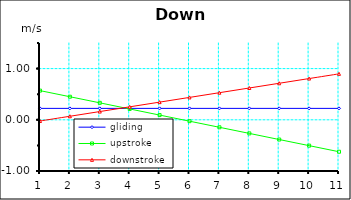
| Category | gliding | upstroke | downstroke |
|---|---|---|---|
| 0 | 0.223 | 0.57 | -0.023 |
| 1 | 0.223 | 0.451 | 0.069 |
| 2 | 0.223 | 0.331 | 0.161 |
| 3 | 0.223 | 0.212 | 0.253 |
| 4 | 0.223 | 0.092 | 0.345 |
| 5 | 0.223 | -0.027 | 0.437 |
| 6 | 0.223 | -0.146 | 0.529 |
| 7 | 0.223 | -0.266 | 0.621 |
| 8 | 0.223 | -0.385 | 0.713 |
| 9 | 0.223 | -0.505 | 0.806 |
| 10 | 0.223 | -0.624 | 0.898 |